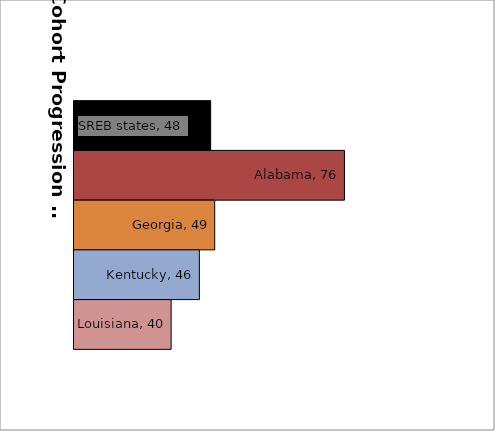
| Category | SREB states | Alabama | Georgia | Kentucky | Louisiana |
|---|---|---|---|---|---|
| 0 | 48.251 | 75.912 | 49.087 | 45.914 | 40.074 |